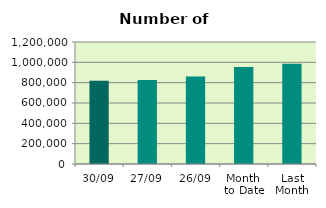
| Category | Series 0 |
|---|---|
| 30/09 | 818450 |
| 27/09 | 826938 |
| 26/09 | 860476 |
| Month 
to Date | 952931.048 |
| Last
Month | 986270.455 |